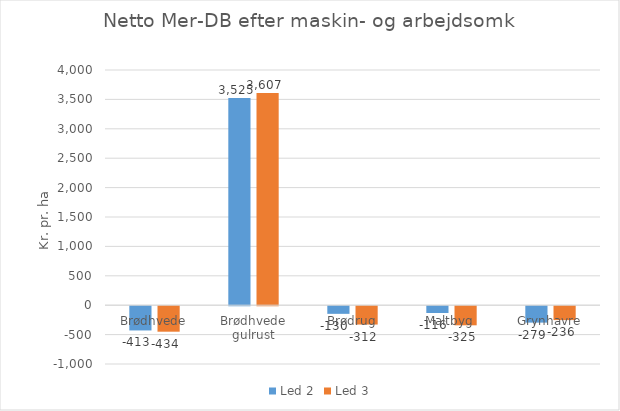
| Category | Led 2 | Led 3 |
|---|---|---|
| Brødhvede | -412.55 | -433.65 |
| Brødhvede gulrust | 3524.5 | 3606.75 |
| Brødrug | -130 | -312 |
| Maltbyg | -115.75 | -325 |
| Grynhavre | -279.2 | -236.25 |